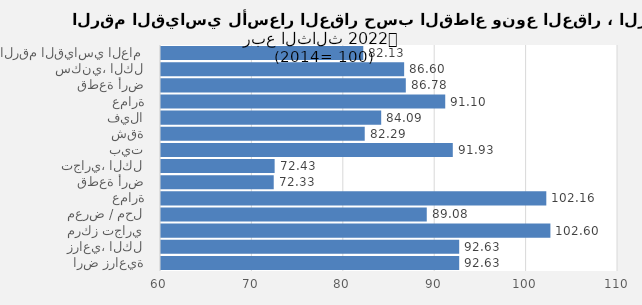
| Category | 2022 |
|---|---|
| الرقم القياسي العام | 82.132 |
| سكني، الكل | 86.603 |
| قطعة أرض | 86.784 |
| عمارة | 91.098 |
| فيلا | 84.091 |
| شقة | 82.29 |
| بيت | 91.925 |
| تجاري، الكل | 72.433 |
| قطعة أرض | 72.334 |
| عمارة | 102.156 |
| معرض / محل | 89.077 |
| مركز تجاري | 102.604 |
| زراعي، الكل | 92.625 |
| ارض زراعية | 92.625 |